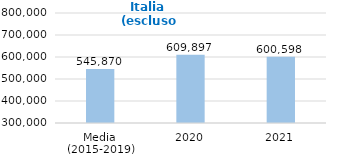
| Category | Italia - Lombardia |
|---|---|
| Media 
(2015-2019) | 545870.2 |
| 2020 | 609897 |
| 2021 | 600598 |